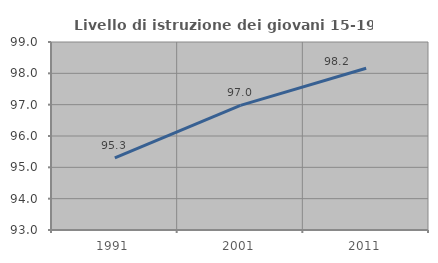
| Category | Livello di istruzione dei giovani 15-19 anni |
|---|---|
| 1991.0 | 95.302 |
| 2001.0 | 96.977 |
| 2011.0 | 98.161 |